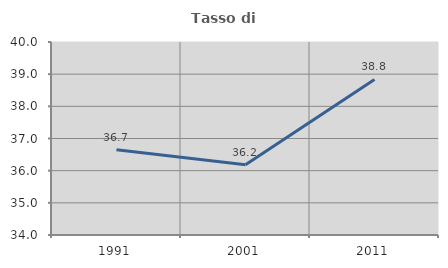
| Category | Tasso di occupazione   |
|---|---|
| 1991.0 | 36.653 |
| 2001.0 | 36.181 |
| 2011.0 | 38.838 |